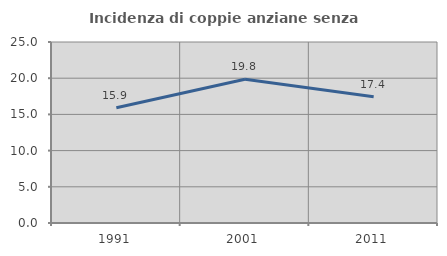
| Category | Incidenza di coppie anziane senza figli  |
|---|---|
| 1991.0 | 15.913 |
| 2001.0 | 19.847 |
| 2011.0 | 17.435 |